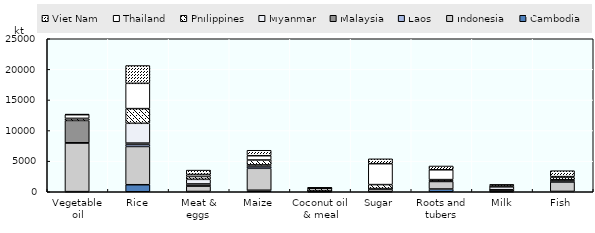
| Category | Cambodia | Indonesia | Laos | Malaysia | Myanmar | Philippines | Thailand | Viet Nam |
|---|---|---|---|---|---|---|---|---|
| Vegetable oil | 19.254 | 7969.359 | 15.475 | 3645.972 | 38.362 | 302.864 | 601.577 | 86.449 |
| Rice | 1148.05 | 6252.018 | 354.895 | 197.314 | 3234.232 | 2398.251 | 4132.268 | 2907.957 |
| Meat & eggs | 42.98 | 882.452 | 28.515 | 322.882 | 751.626 | 463.494 | 330.135 | 715.536 |
| Maize | 245.305 | 3584.672 | 299.41 | 10.295 | 248.836 | 800.487 | 699.874 | 894.004 |
| Coconut oil & meal | 2.039 | 198.235 | 0 | 5.275 | 0 | 408.879 | 3.537 | 4.355 |
| Sugar | 11.025 | 380.447 | 45.558 | 1.082 | 85.194 | 644.22 | 3419.56 | 794.036 |
| Roots and tubers | 448.116 | 1230.079 | 94.18 | 5.1 | 48.271 | 158.448 | 1608.01 | 617.847 |
| Milk | 5.22 | 314.192 | 2.451 | 11.844 | 506.938 | 1.588 | 188.701 | 176.596 |
| Fish | 52.03 | 1569.24 | 25.604 | 115.684 | 190.914 | 402.748 | 118.103 | 966.097 |